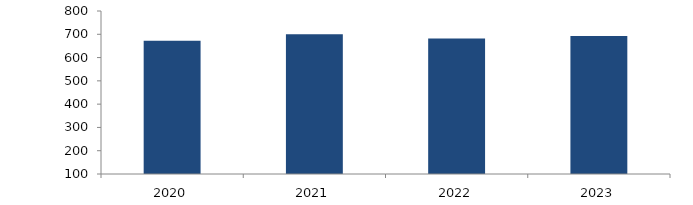
| Category | Bogotá |
|---|---|
| 2020.0 | 672.045 |
| 2021.0 | 699.739 |
| 2022.0 | 681.799 |
| 2023.0 | 692.564 |